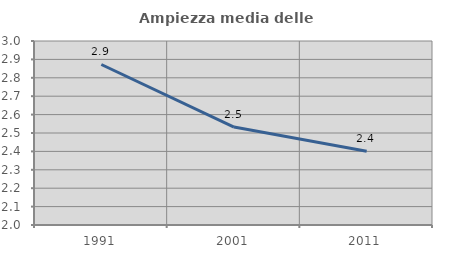
| Category | Ampiezza media delle famiglie |
|---|---|
| 1991.0 | 2.872 |
| 2001.0 | 2.532 |
| 2011.0 | 2.401 |